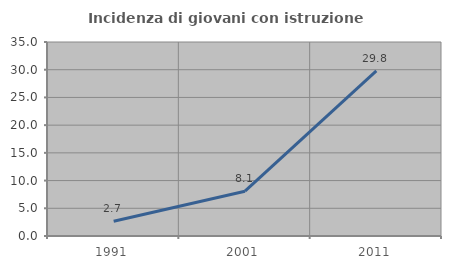
| Category | Incidenza di giovani con istruzione universitaria |
|---|---|
| 1991.0 | 2.667 |
| 2001.0 | 8.081 |
| 2011.0 | 29.808 |